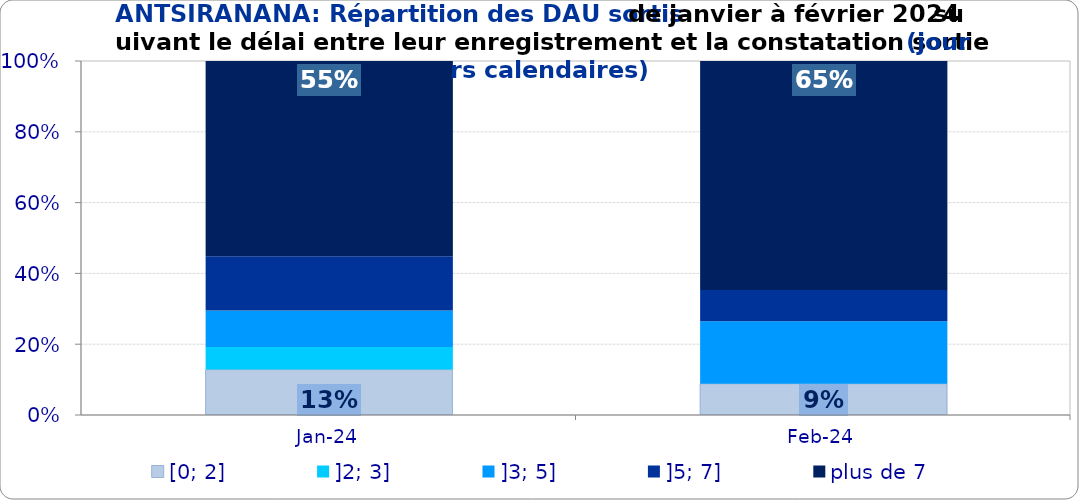
| Category | [0; 2] | ]2; 3] | ]3; 5] | ]5; 7] | plus de 7 |
|---|---|---|---|---|---|
| 2024-01-01 | 0.128 | 0.064 | 0.103 | 0.154 | 0.551 |
| 2024-02-01 | 0.088 | 0 | 0.176 | 0.088 | 0.647 |